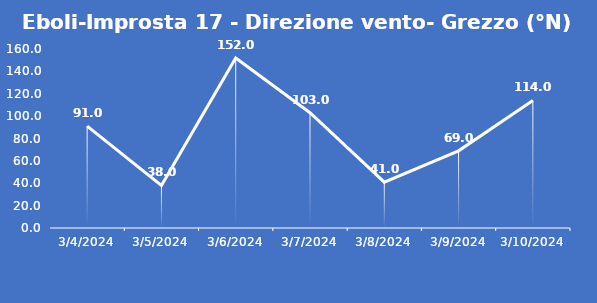
| Category | Eboli-Improsta 17 - Direzione vento- Grezzo (°N) |
|---|---|
| 3/4/24 | 91 |
| 3/5/24 | 38 |
| 3/6/24 | 152 |
| 3/7/24 | 103 |
| 3/8/24 | 41 |
| 3/9/24 | 69 |
| 3/10/24 | 114 |